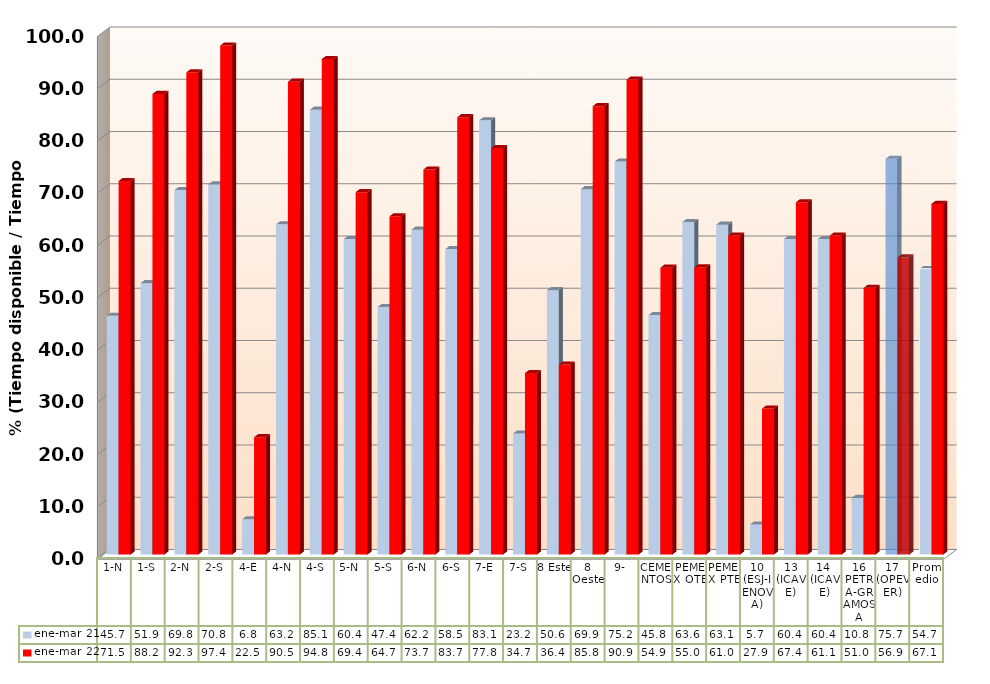
| Category | ene-mar 21 | ene-mar 22 |
|---|---|---|
| 1-N | 45.691 | 71.487 |
| 1-S | 51.936 | 88.153 |
| 2-N | 69.753 | 92.287 |
| 2-S | 70.833 | 97.431 |
| 4-E | 6.751 | 22.456 |
| 4-N | 63.199 | 90.5 |
| 4-S | 85.145 | 94.827 |
| 5-N | 60.37 | 69.36 |
| 5-S | 47.359 | 64.738 |
| 6-N | 62.176 | 73.688 |
| 6-S | 58.463 | 83.704 |
| 7-E | 83.105 | 77.788 |
| 7-S | 23.165 | 34.722 |
| 8 Este | 50.595 | 36.363 |
| 8 Oeste | 69.93 | 85.806 |
| 9- | 75.204 | 90.912 |
| CEMENTOS | 45.825 | 54.912 |
| PEMEX OTE | 63.642 | 54.972 |
| PEMEX PTE | 63.136 | 61.042 |
| 10 (ESJ-IENOVA) | 5.744 | 27.929 |
| 13 (ICAVE) | 60.374 | 67.431 |
| 14  (ICAVE) | 60.374 | 61.05 |
| 16 PETRA-GRAMOSA | 10.836 | 51.041 |
| 17 (OPEVER) | 75.738 | 56.86 |
| Promedio | 54.72 | 67.1 |